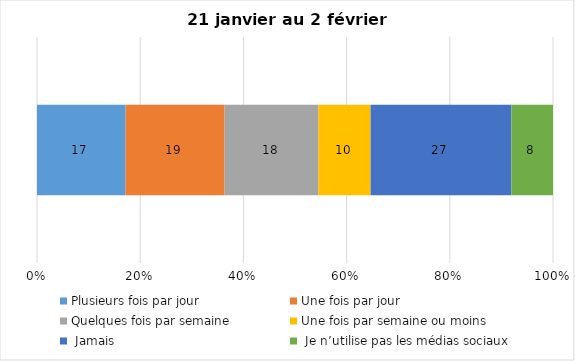
| Category | Plusieurs fois par jour | Une fois par jour | Quelques fois par semaine   | Une fois par semaine ou moins   |  Jamais   |  Je n’utilise pas les médias sociaux |
|---|---|---|---|---|---|---|
| 0 | 17 | 19 | 18 | 10 | 27 | 8 |